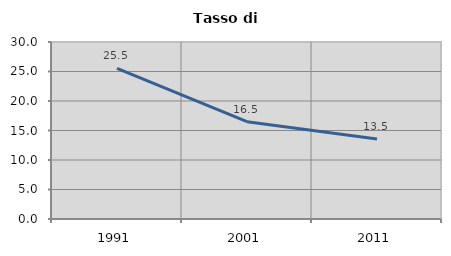
| Category | Tasso di disoccupazione   |
|---|---|
| 1991.0 | 25.513 |
| 2001.0 | 16.498 |
| 2011.0 | 13.546 |